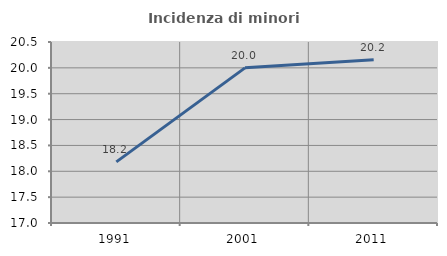
| Category | Incidenza di minori stranieri |
|---|---|
| 1991.0 | 18.182 |
| 2001.0 | 20 |
| 2011.0 | 20.155 |